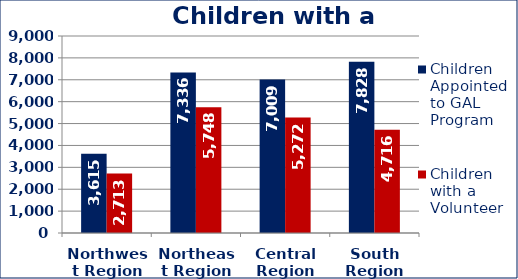
| Category | Children Appointed to GAL Program  | Children with a Volunteer  |
|---|---|---|
| Northwest Region | 3615 | 2713 |
| Northeast Region | 7336 | 5748 |
| Central Region | 7009 | 5272 |
| South Region | 7828 | 4716 |